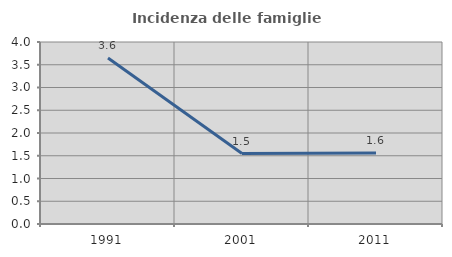
| Category | Incidenza delle famiglie numerose |
|---|---|
| 1991.0 | 3.648 |
| 2001.0 | 1.547 |
| 2011.0 | 1.56 |